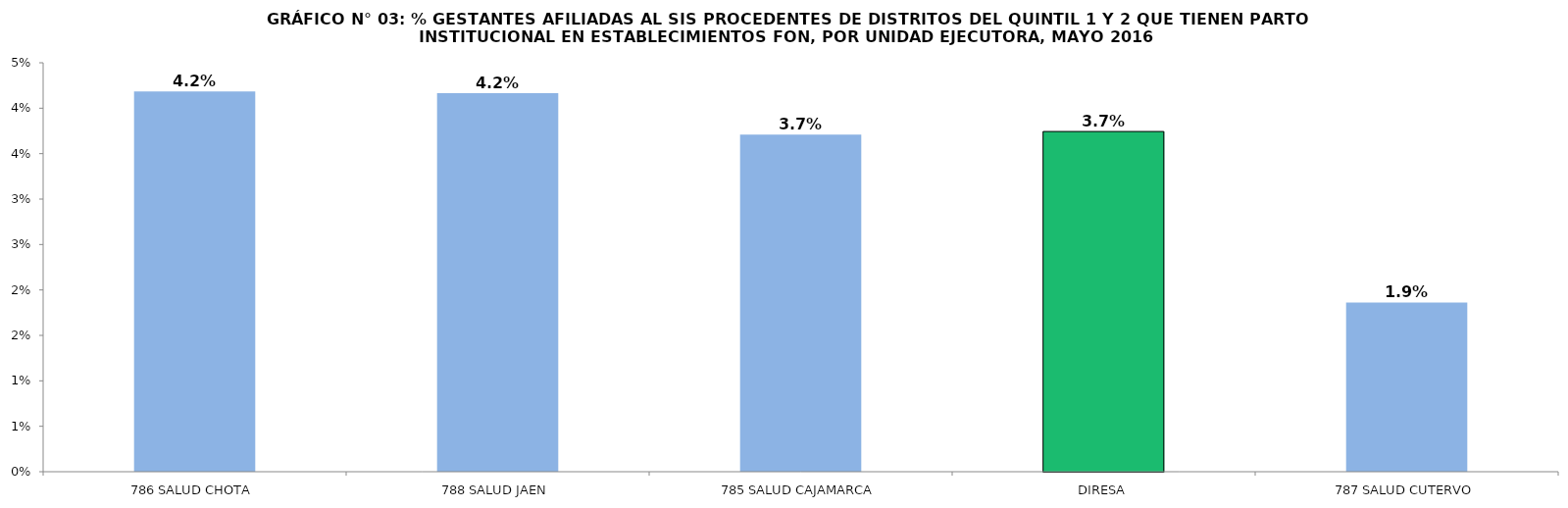
| Category | % GESTANTES AFILIADAS AL SIS PROCEDENTES DE DISTRITOS DEL QUINTIL 1 Y 2 QUE TIENEN PARTO INSTITUCIONAL EN ESTABLECIMIENTOS FON |
|---|---|
| 786 SALUD CHOTA | 0.042 |
| 788 SALUD JAEN | 0.042 |
| 785 SALUD CAJAMARCA | 0.037 |
| DIRESA | 0.037 |
| 787 SALUD CUTERVO | 0.019 |